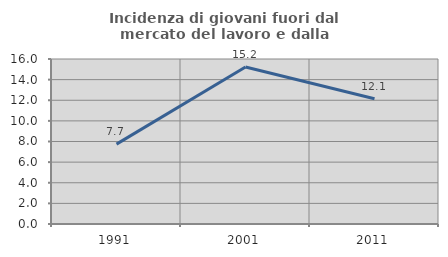
| Category | Incidenza di giovani fuori dal mercato del lavoro e dalla formazione  |
|---|---|
| 1991.0 | 7.742 |
| 2001.0 | 15.232 |
| 2011.0 | 12.15 |